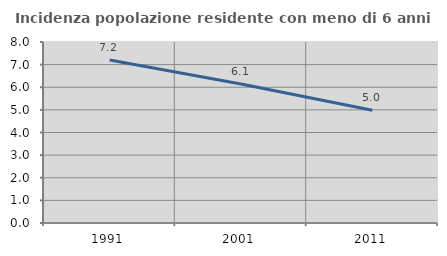
| Category | Incidenza popolazione residente con meno di 6 anni |
|---|---|
| 1991.0 | 7.202 |
| 2001.0 | 6.146 |
| 2011.0 | 4.98 |